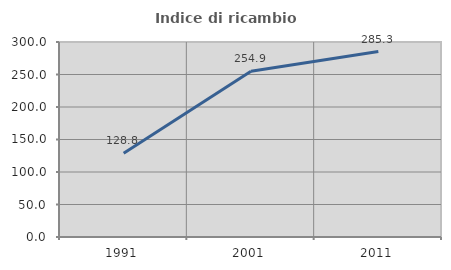
| Category | Indice di ricambio occupazionale  |
|---|---|
| 1991.0 | 128.814 |
| 2001.0 | 254.878 |
| 2011.0 | 285.263 |